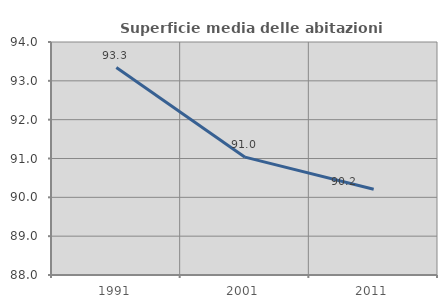
| Category | Superficie media delle abitazioni occupate |
|---|---|
| 1991.0 | 93.342 |
| 2001.0 | 91.035 |
| 2011.0 | 90.209 |